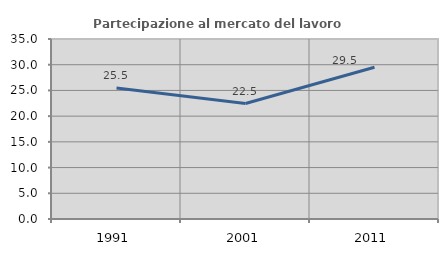
| Category | Partecipazione al mercato del lavoro  femminile |
|---|---|
| 1991.0 | 25.453 |
| 2001.0 | 22.453 |
| 2011.0 | 29.505 |